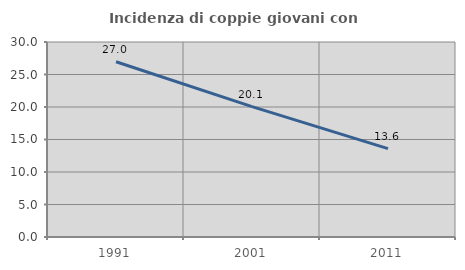
| Category | Incidenza di coppie giovani con figli |
|---|---|
| 1991.0 | 26.961 |
| 2001.0 | 20.064 |
| 2011.0 | 13.6 |